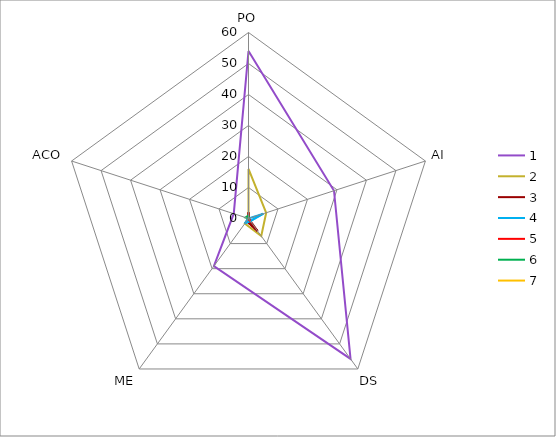
| Category | 1 | 2 | 3 | 4 | 5 | 6 | 7 |
|---|---|---|---|---|---|---|---|
| 0 | 54 | 16 | 2 | 0 | 0 | 1 | 0 |
| 1 | 29 | 6 | 0 | 5 | 0 | 0 | 0 |
| 2 | 56 | 7 | 5 | 1 | 1 | 0 | 0 |
| 3 | 19 | 2 | 1 | 2 | 0 | 0 | 0 |
| 4 | 5 | 0 | 0 | 0 | 0 | 1 | 0 |